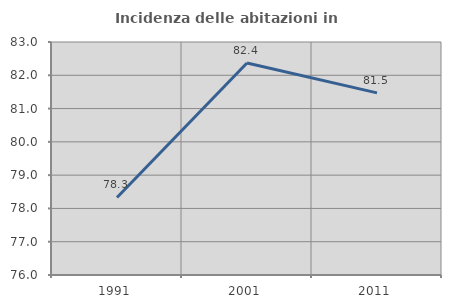
| Category | Incidenza delle abitazioni in proprietà  |
|---|---|
| 1991.0 | 78.329 |
| 2001.0 | 82.37 |
| 2011.0 | 81.473 |